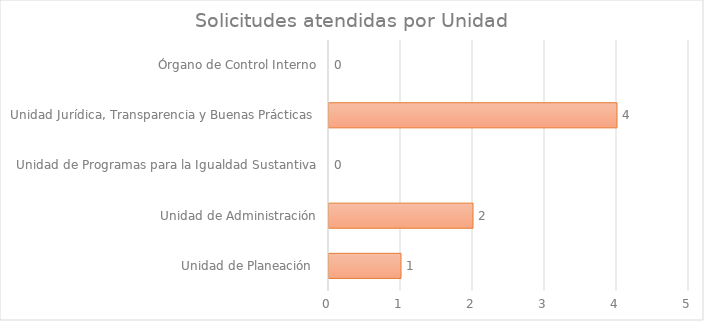
| Category | Series 1 |
|---|---|
| Unidad de Planeación  | 1 |
| Unidad de Administración | 2 |
| Unidad de Programas para la Igualdad Sustantiva | 0 |
| Unidad Jurídica, Transparencia y Buenas Prácticas  | 4 |
| Órgano de Control Interno | 0 |